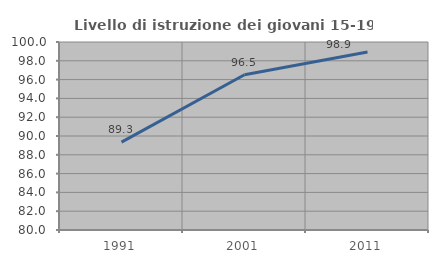
| Category | Livello di istruzione dei giovani 15-19 anni |
|---|---|
| 1991.0 | 89.344 |
| 2001.0 | 96.517 |
| 2011.0 | 98.946 |